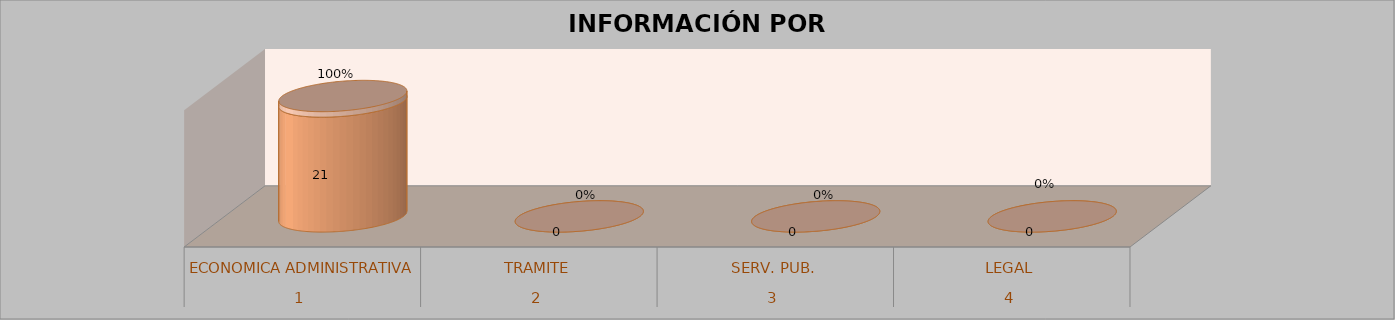
| Category | Series 0 | Series 1 | Series 2 | Series 3 |
|---|---|---|---|---|
| 0 |  |  | 21 | 1 |
| 1 |  |  | 0 | 0 |
| 2 |  |  | 0 | 0 |
| 3 |  |  | 0 | 0 |